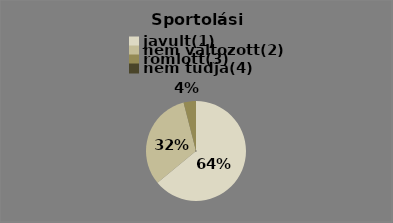
| Category | Series 0 | Series 1 |
|---|---|---|
| javult(1) | 16 | 64 |
| nem változott(2) | 8 | 32 |
| romlott(3) | 1 | 4 |
| nem tudja(4) | 0 | 0 |